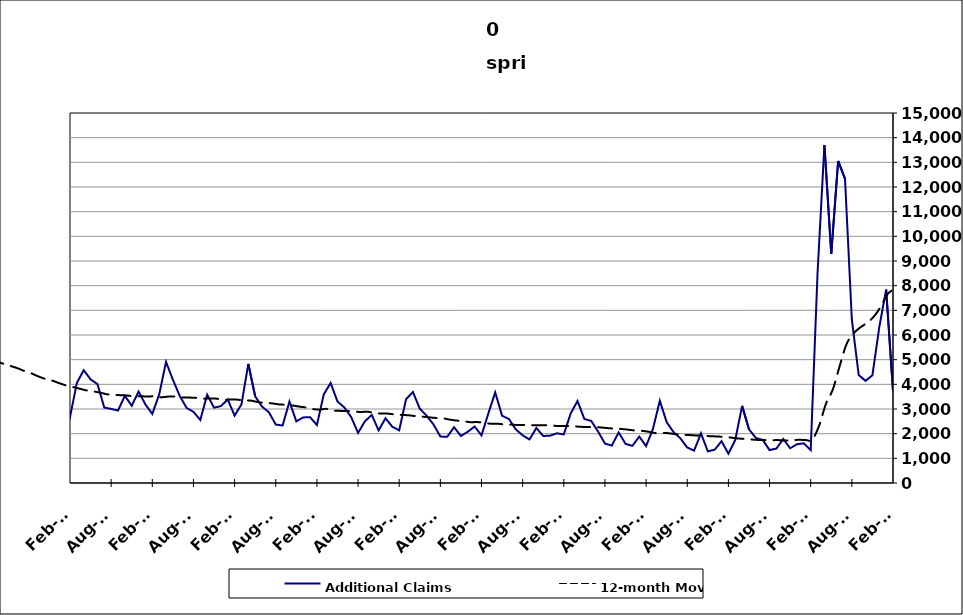
| Category | Additional Claims |
|---|---|
| 2005-05-31 | 3131 |
| 2005-06-30 | 2953 |
| 2005-07-31 | 2452 |
| 2005-08-31 | 1842 |
| 2005-09-30 | 1444 |
| 2005-10-31 | 2141 |
| 2005-11-30 | 1626 |
| 2005-12-31 | 1998 |
| 2006-01-31 | 1588 |
| 2006-02-28 | 1445 |
| 2006-03-31 | 1949 |
| 2006-04-30 | 2959 |
| 2006-05-31 | 2381 |
| 2006-06-30 | 2220 |
| 2006-07-31 | 2123 |
| 2006-08-31 | 1525 |
| 2006-09-30 | 1615 |
| 2006-10-31 | 1860 |
| 2006-11-30 | 1507 |
| 2006-12-31 | 1965 |
| 2007-01-31 | 2023 |
| 2007-02-28 | 1616 |
| 2007-03-31 | 2671 |
| 2007-04-30 | 3721 |
| 2007-05-31 | 2286 |
| 2007-06-30 | 3372 |
| 2007-07-30 | 2459 |
| 2007-08-31 | 1980 |
| 2007-09-30 | 2331 |
| 2007-10-31 | 2490 |
| 2007-11-15 | 1970 |
| 2007-12-15 09:36:00 | 2318 |
| 2008-01-14 19:12:00 | 2557 |
| 2008-02-14 04:48:00 | 2676 |
| 2008-03-15 14:24:00 | 3345 |
| 2008-04-15 | 4771 |
| 2008-05-15 09:36:00 | 3529 |
| 2008-06-14 19:12:00 | 4044 |
| 2008-07-15 04:48:00 | 3468 |
| 2008-08-14 14:24:00 | 2936 |
| 2008-09-14 | 3327 |
| 2008-10-14 09:36:00 | 4398 |
| 2008-11-13 19:12:00 | 4288 |
| 2008-12-14 04:48:00 | 4919 |
| 2009-01-13 14:24:00 | 4529 |
| 2009-02-13 | 4588 |
| 2009-03-15 09:36:00 | 6230 |
| 2009-04-14 19:12:00 | 6528 |
| 2009-05-15 04:48:00 | 5710 |
| 2009-06-14 14:24:00 | 5729 |
| 2009-07-15 | 5181 |
| 2009-08-14 09:36:00 | 4471 |
| 2009-09-13 19:12:00 | 4514 |
| 2009-10-14 04:48:00 | 4928 |
| 2009-11-13 14:24:00 | 4288 |
| 2009-12-14 | 4919 |
| 2010-01-13 09:36:00 | 4406 |
| 2010-02-12 19:12:00 | 3451 |
| 2010-03-15 04:48:00 | 4910 |
| 2010-04-14 14:24:00 | 5413 |
| 2010-05-15 | 4664 |
| 2010-06-14 09:36:00 | 4652 |
| 2010-07-14 19:12:00 | 3833 |
| 2010-08-14 04:48:00 | 3333 |
| 2010-09-13 14:24:00 | 3073 |
| 2010-10-14 | 3708 |
| 2010-11-13 09:36:00 | 3510 |
| 2010-12-13 19:12:00 | 3680 |
| 2011-01-13 04:48:00 | 3314 |
| 2011-02-12 14:24:00 | 2671 |
| 2011-03-15 | 4059 |
| 2011-04-14 09:36:00 | 4574 |
| 2011-05-14 19:12:00 | 4200 |
| 2011-06-14 04:48:00 | 4010 |
| 2011-07-14 14:24:00 | 3058 |
| 2011-08-14 | 3003 |
| 2011-09-13 09:36:00 | 2938 |
| 2011-10-13 19:12:00 | 3534 |
| 2011-11-13 04:48:00 | 3132 |
| 2011-12-13 14:24:00 | 3706 |
| 2012-01-13 | 3182 |
| 2012-02-12 09:36:00 | 2802 |
| 2012-03-13 19:12:00 | 3584 |
| 2012-04-13 04:48:00 | 4909 |
| 2012-05-13 14:24:00 | 4188 |
| 2012-06-13 | 3531 |
| 2012-07-13 09:36:00 | 3044 |
| 2012-08-12 19:12:00 | 2885 |
| 2012-09-12 04:48:00 | 2556 |
| 2012-10-12 14:24:00 | 3582 |
| 2012-11-12 | 3054 |
| 2012-12-12 09:36:00 | 3117 |
| 2013-01-11 19:12:00 | 3385 |
| 2013-02-11 04:48:00 | 2732 |
| 2013-03-13 14:24:00 | 3189 |
| 2013-04-13 | 4828 |
| 2013-05-13 09:36:00 | 3513 |
| 2013-06-12 19:12:00 | 3099 |
| 2013-07-13 04:48:00 | 2867 |
| 2013-08-12 14:24:00 | 2371 |
| 2013-09-12 | 2330 |
| 2013-10-12 09:36:00 | 3301 |
| 2013-11-11 19:12:00 | 2499 |
| 2013-12-12 04:48:00 | 2658 |
| 2014-01-11 14:24:00 | 2669 |
| 2014-02-11 | 2351 |
| 2014-03-13 09:36:00 | 3592 |
| 2014-04-12 19:12:00 | 4054 |
| 2014-05-13 04:48:00 | 3305 |
| 2014-06-12 14:24:00 | 3062 |
| 2014-07-13 | 2671 |
| 2014-08-12 09:36:00 | 2031 |
| 2014-09-11 19:12:00 | 2501 |
| 2014-10-12 04:48:00 | 2759 |
| 2014-11-11 14:24:00 | 2132 |
| 2014-12-12 | 2624 |
| 2015-01-11 09:36:00 | 2280 |
| 2015-02-10 19:12:00 | 2135 |
| 2015-03-13 04:48:00 | 3396 |
| 2015-04-12 14:24:00 | 3689 |
| 2015-05-13 | 3015 |
| 2015-06-12 09:36:00 | 2729 |
| 2015-07-12 19:12:00 | 2373 |
| 2015-08-12 04:48:00 | 1884 |
| 2015-09-11 14:24:00 | 1872 |
| 2015-10-12 | 2261 |
| 2015-11-11 09:36:00 | 1906 |
| 2015-12-11 19:12:00 | 2079 |
| 2016-01-11 04:48:00 | 2289 |
| 2016-02-10 14:24:00 | 1931 |
| 2016-03-12 | 2822 |
| 2016-04-11 09:36:00 | 3674 |
| 2016-05-11 19:12:00 | 2728 |
| 2016-06-11 04:48:00 | 2594 |
| 2016-07-11 14:24:00 | 2175 |
| 2016-08-11 | 1931 |
| 2016-09-10 09:36:00 | 1765 |
| 2016-10-10 19:12:00 | 2230 |
| 2016-11-10 04:48:00 | 1905 |
| 2016-12-10 14:24:00 | 1919 |
| 2017-01-10 | 2015 |
| 2017-02-09 09:36:00 | 1968 |
| 2017-03-11 19:12:00 | 2817 |
| 2017-04-11 04:48:00 | 3325 |
| 2017-05-11 14:24:00 | 2596 |
| 2017-06-11 | 2516 |
| 2017-07-11 09:36:00 | 2084 |
| 2017-08-10 19:12:00 | 1597 |
| 2017-09-10 04:48:00 | 1518 |
| 2017-10-10 14:24:00 | 2050 |
| 2017-11-10 | 1589 |
| 2017-12-10 09:36:00 | 1505 |
| 2018-01-09 19:12:00 | 1882 |
| 2018-02-09 04:48:00 | 1495 |
| 2018-03-11 14:24:00 | 2194 |
| 2018-04-11 | 3332 |
| 2018-05-11 09:36:00 | 2466 |
| 2018-06-10 19:12:00 | 2063 |
| 2018-07-11 04:48:00 | 1809 |
| 2018-08-10 14:24:00 | 1440 |
| 2018-09-10 | 1313 |
| 2018-10-10 09:36:00 | 2015 |
| 2018-11-09 19:12:00 | 1282 |
| 2018-12-10 04:48:00 | 1351 |
| 2019-01-09 14:24:00 | 1695 |
| 2019-02-09 | 1189 |
| 2019-03-11 09:36:00 | 1746 |
| 2019-04-10 19:12:00 | 3126 |
| 2019-05-11 04:48:00 | 2174 |
| 2019-06-10 14:24:00 | 1827 |
| 2019-07-11 | 1744 |
| 2019-08-10 09:36:00 | 1335 |
| 2019-09-09 19:12:00 | 1398 |
| 2019-10-10 04:48:00 | 1790 |
| 2019-11-09 14:24:00 | 1407 |
| 2019-12-10 | 1573 |
| 2020-01-09 09:36:00 | 1610 |
| 2020-02-08 19:12:00 | 1333 |
| 2020-03-10 04:48:00 | 8532 |
| 2020-04-09 14:24:00 | 13699 |
| 2020-05-10 | 9300 |
| 2020-06-09 09:36:00 | 13055 |
| 2020-07-09 19:12:00 | 12333 |
| 2020-08-09 04:48:00 | 6620 |
| 2020-09-08 14:24:00 | 4377 |
| 2020-10-09 | 4142 |
| 2020-11-08 09:36:00 | 4370 |
| 2020-12-08 19:12:00 | 6320 |
| 2021-01-08 04:48:00 | 7842 |
| 2021-02-07 14:24:00 | 3728 |